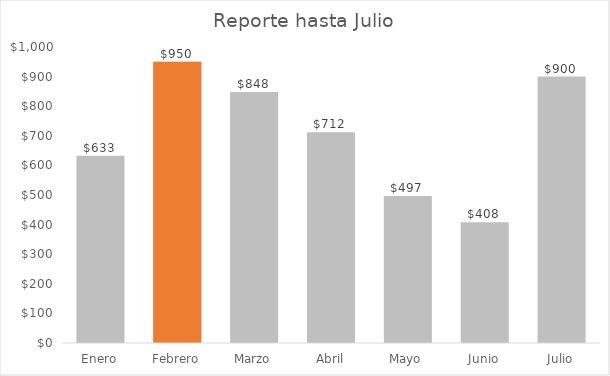
| Category | Ventas | Máximo |
|---|---|---|
| Enero | 633 | 0 |
| Febrero | 950 | 950 |
| Marzo | 848 | 0 |
| Abril | 712 | 0 |
| Mayo | 497 | 0 |
| Junio | 408 | 0 |
| Julio | 900 | 0 |